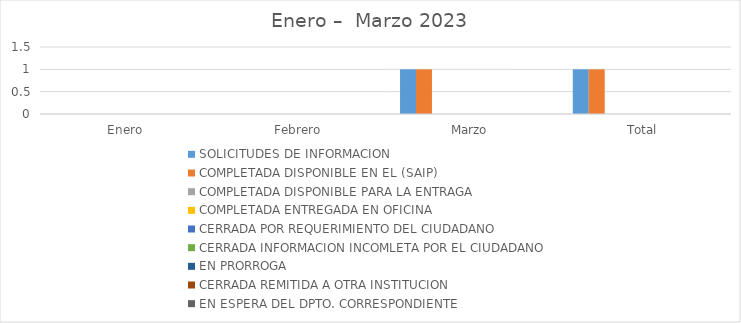
| Category | SOLICITUDES DE INFORMACION | COMPLETADA DISPONIBLE EN EL (SAIP) | COMPLETADA DISPONIBLE PARA LA ENTRAGA | COMPLETADA ENTREGADA EN OFICINA | CERRADA POR REQUERIMIENTO DEL CIUDADANO | CERRADA INFORMACION INCOMLETA POR EL CIUDADANO | EN PRORROGA | CERRADA REMITIDA A OTRA INSTITUCION | EN ESPERA DEL DPTO. CORRESPONDIENTE |
|---|---|---|---|---|---|---|---|---|---|
| Enero | 0 | 0 | 0 | 0 | 0 | 0 | 0 | 0 | 0 |
| Febrero | 0 | 0 | 0 | 0 | 0 | 0 | 0 | 0 | 0 |
| Marzo | 1 | 1 | 0 | 0 | 0 | 0 | 0 | 0 | 0 |
| Total | 1 | 1 | 0 | 0 | 0 | 0 | 0 | 0 | 0 |